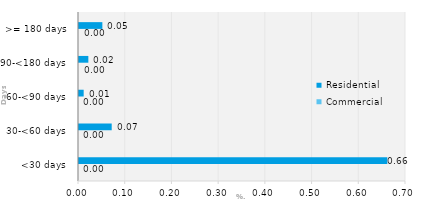
| Category | Commercial | Residential |
|---|---|---|
| <30 days | 0 | 0.66 |
| 30-<60 days | 0 | 0.07 |
| 60-<90 days | 0 | 0.01 |
| 90-<180 days | 0 | 0.02 |
| >= 180 days | 0 | 0.05 |